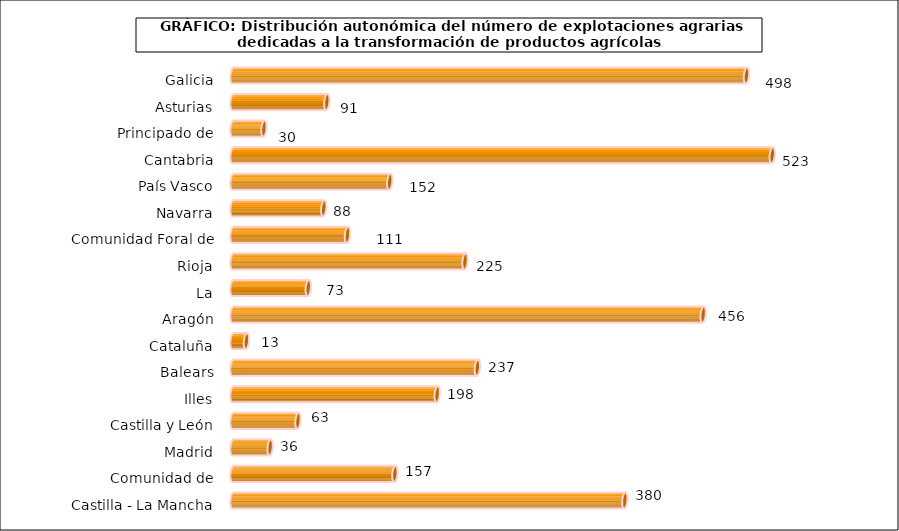
| Category | num. Explotaciones |
|---|---|
| 0 | 498 |
| 1 | 91 |
| 2 | 30 |
| 3 | 523 |
| 4 | 152 |
| 5 | 88 |
| 6 | 111 |
| 7 | 225 |
| 8 | 73 |
| 9 | 456 |
| 10 | 13 |
| 11 | 237 |
| 12 | 198 |
| 13 | 63 |
| 14 | 36 |
| 15 | 157 |
| 16 | 380 |